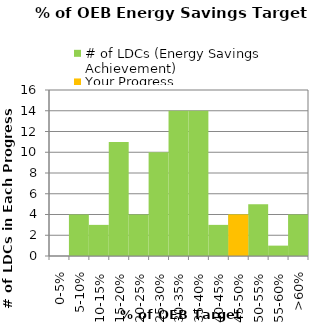
| Category | # of LDCs (Energy Savings Achievement) | Your Progress |
|---|---|---|
| 0-5% | 0 | 0 |
| 5-10% | 4 | 0 |
| 10-15% | 3 | 0 |
| 15-20% | 11 | 0 |
| 20-25% | 4 | 0 |
| 25-30% | 10 | 0 |
| 30-35% | 14 | 0 |
| 35-40% | 14 | 0 |
| 40-45% | 3 | 0 |
| 45-50% | 4 | 4 |
| 50-55% | 5 | 0 |
| 55-60% | 1 | 0 |
| >60% | 4 | 0 |